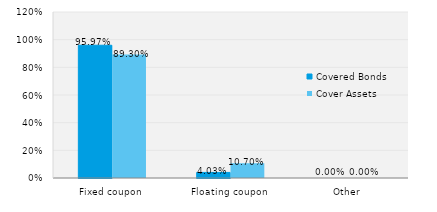
| Category | Covered Bonds | Cover Assets |
|---|---|---|
| Fixed coupon | 0.96 | 0.893 |
| Floating coupon | 0.04 | 0.107 |
| Other | 0 | 0 |